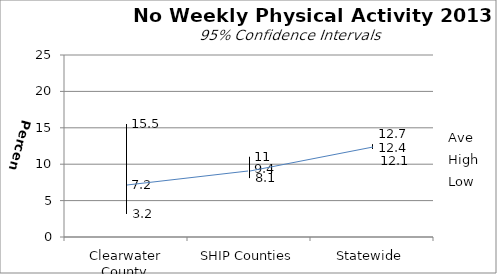
| Category | Ave | High | Low |
|---|---|---|---|
| Clearwater County | 7.2 | 15.5 | 3.2 |
| SHIP Counties | 9.4 | 11 | 8.1 |
| Statewide | 12.4 | 12.7 | 12.1 |